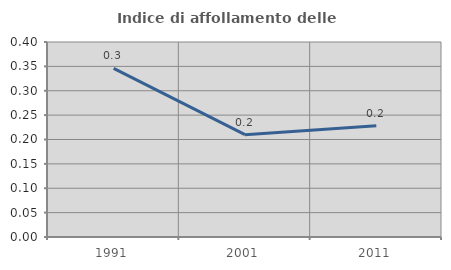
| Category | Indice di affollamento delle abitazioni  |
|---|---|
| 1991.0 | 0.346 |
| 2001.0 | 0.21 |
| 2011.0 | 0.228 |